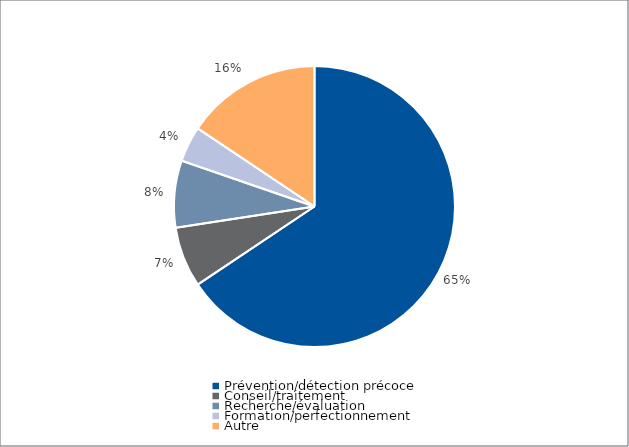
| Category | Series 0 |
|---|---|
| Prévention/détection précoce | 141275.09 |
| Conseil/traitement | 15000 |
| Recherche/évaluation | 16579 |
| Formation/perfectionnement | 8822.81 |
| Autre | 33639.09 |